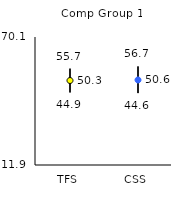
| Category | 25th | 75th | Mean |
|---|---|---|---|
| TFS | 44.9 | 55.7 | 50.31 |
| CSS | 44.6 | 56.7 | 50.56 |